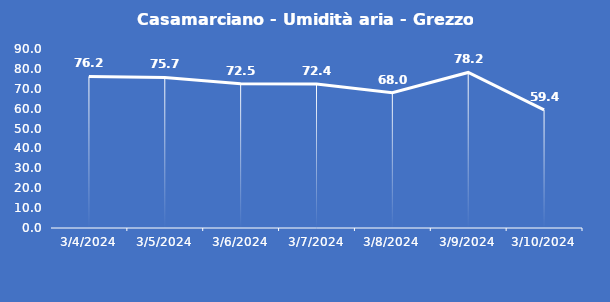
| Category | Casamarciano - Umidità aria - Grezzo (%) |
|---|---|
| 3/4/24 | 76.2 |
| 3/5/24 | 75.7 |
| 3/6/24 | 72.5 |
| 3/7/24 | 72.4 |
| 3/8/24 | 68 |
| 3/9/24 | 78.2 |
| 3/10/24 | 59.4 |